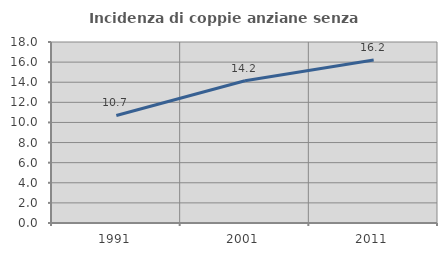
| Category | Incidenza di coppie anziane senza figli  |
|---|---|
| 1991.0 | 10.698 |
| 2001.0 | 14.153 |
| 2011.0 | 16.209 |